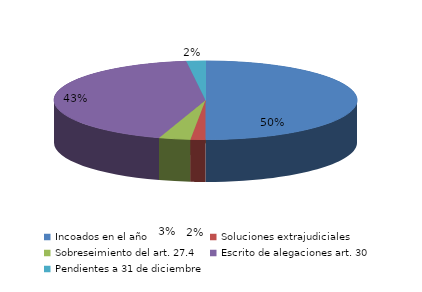
| Category | Series 0 |
|---|---|
| Incoados en el año | 445 |
| Soluciones extrajudiciales | 14 |
| Sobreseimiento del art. 27.4 | 30 |
| Escrito de alegaciones art. 30 | 383 |
| Pendientes a 31 de diciembre | 18 |